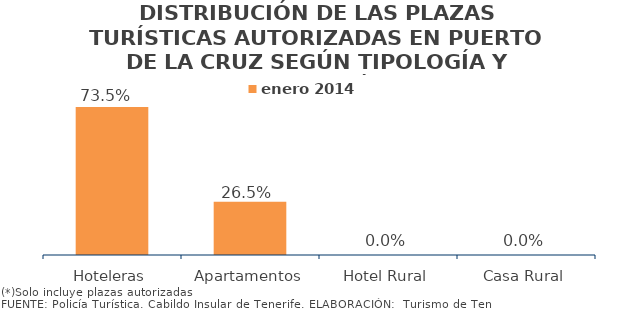
| Category | enero 2014 |
|---|---|
| Hoteleras | 0.735 |
| Apartamentos | 0.265 |
| Hotel Rural | 0 |
| Casa Rural | 0 |